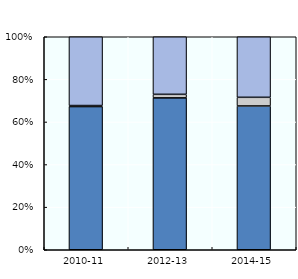
| Category | Multilateral ODA | Multi-bi/non-core | Bilateral ODA, excl. multi-bi  |
|---|---|---|---|
| 2010-11 | 149.364 | 1.072 | 71.761 |
| 2012-13 | 149.122 | 3.476 | 56.52 |
| 2014-15 | 150.35 | 9.056 | 63.324 |